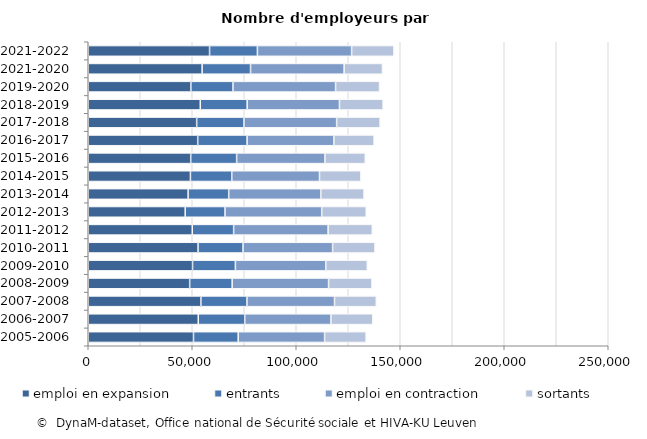
| Category | emploi en expansion | entrants | emploi en contraction | sortants |
|---|---|---|---|---|
| 2021-2022 | 58330 | 22994 | 45304 | 20342 |
| 2021-2020 | 54750 | 23278 | 44993 | 18419 |
| 2019-2020 | 49331 | 20248 | 49322 | 21131 |
| 2018-2019 | 53857 | 22548 | 44372 | 20977 |
| 2017-2018 | 52125 | 22710 | 44587 | 20894 |
| 2016-2017 | 52626 | 23738 | 41734 | 19320 |
| 2015-2016 | 49259 | 22090 | 42439 | 19395 |
| 2014-2015 | 49126 | 19869 | 42187 | 19902 |
| 2013-2014 | 48005 | 19528 | 44272 | 20794 |
| 2012-2013 | 46607 | 19145 | 46478 | 21418 |
| 2011-2012 | 50003 | 19895 | 45425 | 21236 |
| 2010-2011 | 52781 | 21625 | 43079 | 20372 |
| 2009-2010 | 50149 | 20598 | 43458 | 19966 |
| 2008-2009 | 48758 | 20438 | 46345 | 20857 |
| 2007-2008 | 54149 | 22146 | 42096 | 20097 |
| 2006-2007 | 52885 | 22360 | 41434 | 20117 |
| 2005-2006 | 50604 | 21491 | 41543 | 19959 |